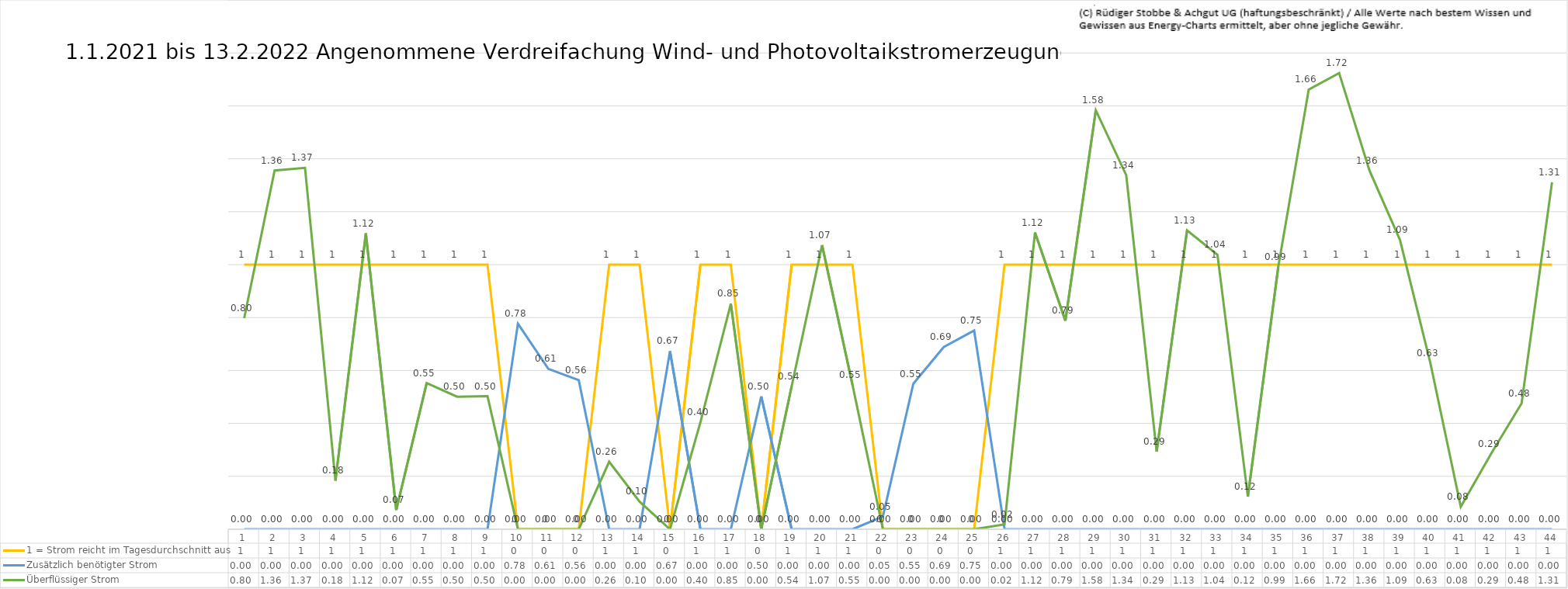
| Category | 1 = Strom reicht im Tagesdurchschnitt aus | Zusätzlich benötigter Strom | Überflüssiger Strom |
|---|---|---|---|
| 0 | 1 | 0 | 0.798 |
| 1 | 1 | 0 | 1.356 |
| 2 | 1 | 0 | 1.366 |
| 3 | 1 | 0 | 0.184 |
| 4 | 1 | 0 | 1.118 |
| 5 | 1 | 0 | 0.073 |
| 6 | 1 | 0 | 0.553 |
| 7 | 1 | 0 | 0.501 |
| 8 | 1 | 0 | 0.503 |
| 9 | 0 | 0.777 | 0 |
| 10 | 0 | 0.606 | 0 |
| 11 | 0 | 0.563 | 0 |
| 12 | 1 | 0 | 0.255 |
| 13 | 1 | 0 | 0.104 |
| 14 | 0 | 0.673 | 0 |
| 15 | 1 | 0 | 0.405 |
| 16 | 1 | 0 | 0.852 |
| 17 | 0 | 0.502 | 0 |
| 18 | 1 | 0 | 0.54 |
| 19 | 1 | 0 | 1.074 |
| 20 | 1 | 0 | 0.546 |
| 21 | 0 | 0.048 | 0 |
| 22 | 0 | 0.55 | 0 |
| 23 | 0 | 0.688 | 0 |
| 24 | 0 | 0.751 | 0 |
| 25 | 1 | 0 | 0.018 |
| 26 | 1 | 0 | 1.121 |
| 27 | 1 | 0 | 0.788 |
| 28 | 1 | 0 | 1.583 |
| 29 | 1 | 0 | 1.338 |
| 30 | 1 | 0 | 0.293 |
| 31 | 1 | 0 | 1.13 |
| 32 | 1 | 0 | 1.037 |
| 33 | 1 | 0 | 0.123 |
| 34 | 1 | 0 | 0.992 |
| 35 | 1 | 0 | 1.662 |
| 36 | 1 | 0 | 1.724 |
| 37 | 1 | 0 | 1.355 |
| 38 | 1 | 0 | 1.094 |
| 39 | 1 | 0 | 0.628 |
| 40 | 1 | 0 | 0.085 |
| 41 | 1 | 0 | 0.286 |
| 42 | 1 | 0 | 0.476 |
| 43 | 1 | 0 | 1.311 |